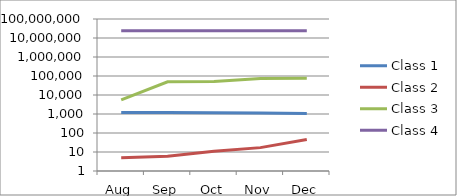
| Category | Class 1 | Class 2 | Class 3 | Class 4 |
|---|---|---|---|---|
| Aug | 1187 | 5 | 5487 | 23954318 |
| Sep | 1184 | 6 | 49493 | 23932519 |
| Oct | 1160 | 11 | 51752 | 23944918 |
| Nov | 1131 | 17 | 74030 | 23941127 |
| Dec | 1078 | 46 | 75711 | 23957573 |